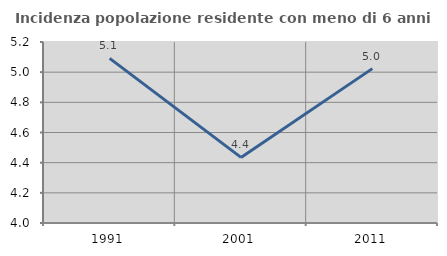
| Category | Incidenza popolazione residente con meno di 6 anni |
|---|---|
| 1991.0 | 5.091 |
| 2001.0 | 4.435 |
| 2011.0 | 5.023 |